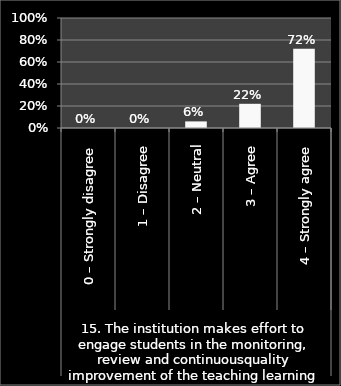
| Category | Series 0 |
|---|---|
| 0 | 0 |
| 1 | 0 |
| 2 | 0.06 |
| 3 | 0.22 |
| 4 | 0.72 |